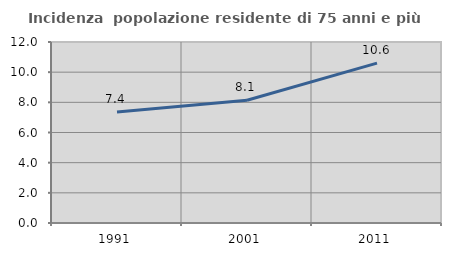
| Category | Incidenza  popolazione residente di 75 anni e più |
|---|---|
| 1991.0 | 7.355 |
| 2001.0 | 8.139 |
| 2011.0 | 10.598 |